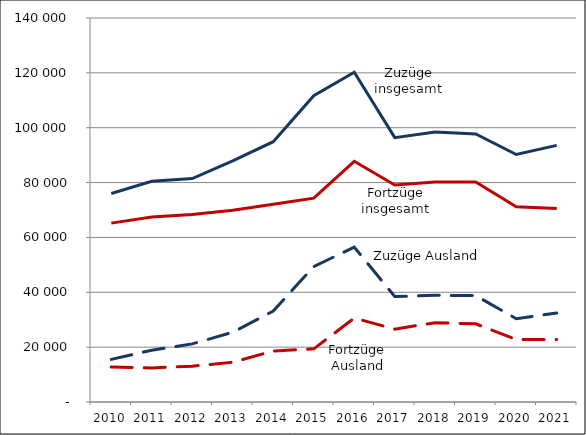
| Category | Zuzüge insgesamt | Zuzüge Ausland | Fortzüge insgesamt | Fortzüge Ausland |
|---|---|---|---|---|
| 2010.0 | 76032 | 15542 | 65209 | 12763 |
| 2011.0 | 80446 | 18887 | 67433 | 12401 |
| 2012.0 | 81472 | 21188 | 68334 | 13076 |
| 2013.0 | 87939 | 25439 | 69872 | 14506 |
| 2014.0 | 94900 | 33167 | 72104 | 18593 |
| 2015.0 | 111661 | 49379 | 74317 | 19376 |
| 2016.0 | 120235 | 56476 | 87754 | 30599 |
| 2017.0 | 96375 | 38438 | 79097 | 26566 |
| 2018.0 | 98424 | 38891 | 80217 | 28929 |
| 2019.0 | 97716 | 38791 | 80195 | 28497 |
| 2020.0 | 90243 | 30375 | 71178 | 22794 |
| 2021.0 | 93568 | 32423 | 70554 | 22771 |